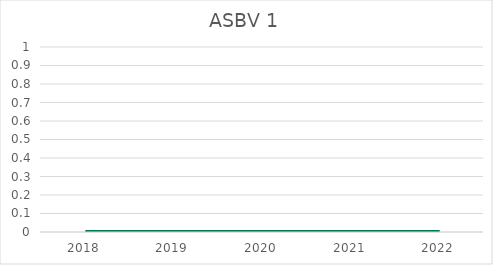
| Category | ASBV 1 |
|---|---|
| 2018.0 | 0 |
| 2019.0 | 0 |
| 2020.0 | 0 |
| 2021.0 | 0 |
| 2022.0 | 0 |